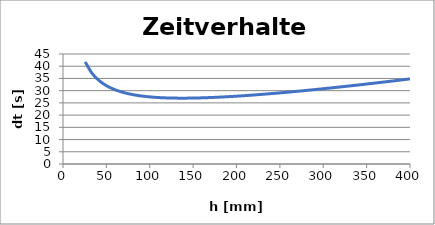
| Category | Series 0 |
|---|---|
| 400.0 | 34.819 |
| 392.2 | 34.481 |
| 384.4 | 34.147 |
| 376.59999999999997 | 33.816 |
| 368.79999999999995 | 33.49 |
| 360.99999999999994 | 33.166 |
| 353.19999999999993 | 32.847 |
| 345.3999999999999 | 32.532 |
| 337.5999999999999 | 32.222 |
| 329.7999999999999 | 31.915 |
| 321.9999999999999 | 31.614 |
| 314.1999999999999 | 31.317 |
| 306.39999999999986 | 31.025 |
| 298.59999999999985 | 30.739 |
| 290.79999999999984 | 30.459 |
| 282.99999999999983 | 30.184 |
| 275.1999999999998 | 29.916 |
| 267.3999999999998 | 29.654 |
| 259.5999999999998 | 29.399 |
| 251.79999999999978 | 29.152 |
| 243.99999999999977 | 28.913 |
| 236.19999999999976 | 28.682 |
| 228.39999999999975 | 28.461 |
| 220.59999999999974 | 28.25 |
| 212.79999999999973 | 28.049 |
| 204.99999999999972 | 27.86 |
| 197.1999999999997 | 27.684 |
| 189.3999999999997 | 27.522 |
| 181.59999999999968 | 27.375 |
| 173.79999999999967 | 27.246 |
| 165.99999999999966 | 27.135 |
| 158.19999999999965 | 27.046 |
| 150.39999999999964 | 26.981 |
| 142.59999999999962 | 26.943 |
| 134.7999999999996 | 26.937 |
| 126.99999999999962 | 26.967 |
| 119.19999999999962 | 27.04 |
| 111.39999999999962 | 27.162 |
| 103.59999999999962 | 27.345 |
| 95.79999999999963 | 27.599 |
| 87.99999999999963 | 27.943 |
| 80.19999999999963 | 28.399 |
| 72.39999999999964 | 28.999 |
| 64.59999999999964 | 29.788 |
| 56.79999999999964 | 30.838 |
| 48.999999999999645 | 32.258 |
| 41.19999999999965 | 34.238 |
| 33.39999999999965 | 37.139 |
| 25.59999999999965 | 41.744 |